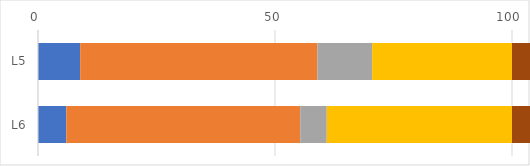
| Category | Series 0 | Series 1 | Series 2 | Series 3 | Series 4 | Series 5 | Series 6 | Series 7 |
|---|---|---|---|---|---|---|---|---|
| L5 | 8.897 | 50.052 | 11.546 | 29.505 | 38.636 | 30.303 | 44.737 | 37.892 |
| L6 | 5.972 | 49.347 | 5.603 | 39.077 | 51.351 | 39.13 | 48.649 | 46.377 |